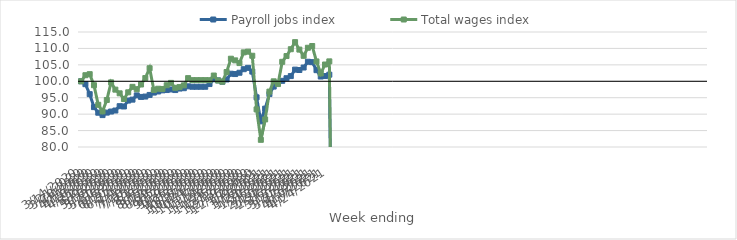
| Category | Payroll jobs index | Total wages index |
|---|---|---|
| 14/03/2020 | 100 | 100 |
| 21/03/2020 | 99.117 | 101.849 |
| 28/03/2020 | 96.08 | 102.168 |
| 04/04/2020 | 92.138 | 98.803 |
| 11/04/2020 | 90.434 | 92.843 |
| 18/04/2020 | 89.706 | 90.838 |
| 25/04/2020 | 90.466 | 94.309 |
| 02/05/2020 | 90.792 | 99.671 |
| 09/05/2020 | 91.1 | 97.453 |
| 16/05/2020 | 92.424 | 96.337 |
| 23/05/2020 | 92.332 | 94.604 |
| 30/05/2020 | 94.132 | 96.642 |
| 06/06/2020 | 94.418 | 98.306 |
| 13/06/2020 | 95.711 | 97.595 |
| 20/06/2020 | 95.239 | 99.017 |
| 27/06/2020 | 95.352 | 100.984 |
| 04/07/2020 | 95.845 | 103.974 |
| 11/07/2020 | 96.562 | 97.347 |
| 18/07/2020 | 96.893 | 97.737 |
| 25/07/2020 | 97.24 | 97.661 |
| 01/08/2020 | 97.334 | 98.801 |
| 08/08/2020 | 97.513 | 99.516 |
| 15/08/2020 | 97.33 | 98.01 |
| 22/08/2020 | 97.792 | 98.236 |
| 29/08/2020 | 97.895 | 98.768 |
| 05/09/2020 | 98.458 | 100.96 |
| 12/09/2020 | 98.335 | 100.352 |
| 19/09/2020 | 98.335 | 100.352 |
| 26/09/2020 | 98.335 | 100.352 |
| 03/10/2020 | 98.335 | 100.352 |
| 10/10/2020 | 99.156 | 100.331 |
| 17/10/2020 | 100.602 | 101.75 |
| 24/10/2020 | 100.284 | 100.237 |
| 31/10/2020 | 99.878 | 99.879 |
| 07/11/2020 | 100.549 | 102.816 |
| 14/11/2020 | 102.3 | 106.871 |
| 21/11/2020 | 102.201 | 106.367 |
| 28/11/2020 | 102.602 | 105.538 |
| 05/12/2020 | 103.68 | 108.806 |
| 12/12/2020 | 104.086 | 109.017 |
| 19/12/2020 | 102.941 | 107.77 |
| 26/12/2020 | 95.118 | 91.442 |
| 02/01/2021 | 87.802 | 82.186 |
| 09/01/2021 | 91.674 | 88.387 |
| 16/01/2021 | 96.103 | 96.854 |
| 23/01/2021 | 98.387 | 99.99 |
| 30/01/2021 | 99.405 | 99.154 |
| 06/02/2021 | 100.143 | 105.923 |
| 13/02/2021 | 100.937 | 107.682 |
| 20/02/2021 | 101.583 | 109.76 |
| 27/02/2021 | 103.551 | 111.913 |
| 06/03/2021 | 103.434 | 109.644 |
| 13/03/2021 | 104.187 | 107.751 |
| 20/03/2021 | 105.942 | 110.206 |
| 27/03/2021 | 105.834 | 110.736 |
| 03/04/2021 | 103.386 | 106.041 |
| 10/04/2021 | 101.448 | 102.385 |
| 17/04/2021 | 101.596 | 105.106 |
| 24/04/2021 | 102.012 | 106.056 |